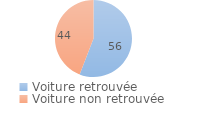
| Category | Series 0 |
|---|---|
| Voiture retrouvée | 55.872 |
| Voiture non retrouvée | 44.128 |